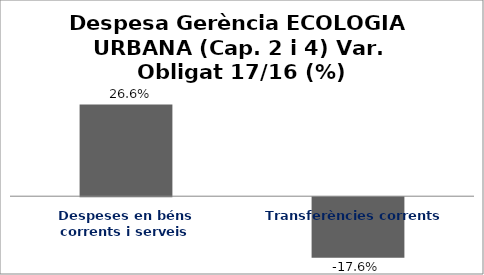
| Category | Series 0 |
|---|---|
| Despeses en béns corrents i serveis | 0.266 |
| Transferències corrents | -0.176 |